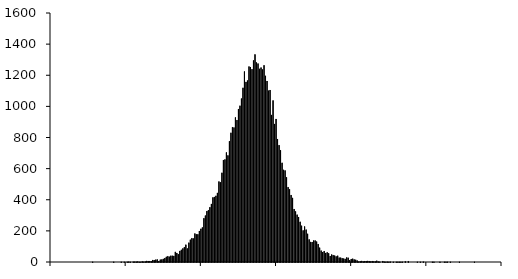
| Category | Series 0 |
|---|---|
| -1.50_-1.49 | 0 |
| -1.49_-1.48 | 0 |
| -1.48_-1.47 | 0 |
| -1.47_-1.46 | 0 |
| -1.46_-1.45 | 0 |
| -1.45_-1.44 | 0 |
| -1.44_-1.43 | 0 |
| -1.43_-1.42 | 0 |
| -1.42_-1.41 | 0 |
| -1.41_-1.40 | 0 |
| -1.40_-1.39 | 0 |
| -1.39_-1.38 | 0 |
| -1.38_-1.37 | 0 |
| -1.37_-1.36 | 0 |
| -1.36_-1.35 | 0 |
| -1.35_-1.34 | 0 |
| -1.34_-1.33 | 0 |
| -1.33_-1.32 | 0 |
| -1.32_-1.31 | 0 |
| -1.31_-1.30 | 0 |
| -1.30_-1.29 | 0 |
| -1.29_-1.28 | 0 |
| -1.28_-1.27 | 0 |
| -1.27_-1.26 | 0 |
| -1.26_-1.25 | 0 |
| -1.25_-1.24 | 0 |
| -1.24_-1.23 | 0 |
| -1.23_-1.22 | 0 |
| -1.22_-1.21 | 1 |
| -1.21_-1.20 | 0 |
| -1.20_-1.19 | 0 |
| -1.19_-1.18 | 0 |
| -1.18_-1.17 | 0 |
| -1.17_-1.16 | 0 |
| -1.16_-1.15 | 0 |
| -1.15_-1.14 | 0 |
| -1.14_-1.13 | 0 |
| -1.13_-1.12 | 0 |
| -1.12_-1.11 | 0 |
| -1.11_-1.10 | 0 |
| -1.10_-1.09 | 0 |
| -1.09_-1.08 | 0 |
| -1.08_-1.07 | 1 |
| -1.07_-1.06 | 0 |
| -1.06_-1.05 | 0 |
| -1.05_-1.04 | 0 |
| -1.04_-1.03 | 0 |
| -1.03_-1.02 | 1 |
| -1.02_-1.01 | 0 |
| -1.01_-1.00 | 1 |
| -1.00_-0.99 | 0 |
| -0.99_-0.98 | 1 |
| -0.98_-0.97 | 2 |
| -0.97_-0.96 | 1 |
| -0.96_-0.95 | 0 |
| -0.95_-0.94 | 2 |
| -0.94_-0.93 | 2 |
| -0.93_-0.92 | 2 |
| -0.92_-0.91 | 3 |
| -0.91_-0.90 | 1 |
| -0.90_-0.89 | 1 |
| -0.89_-0.88 | 4 |
| -0.88_-0.87 | 2 |
| -0.87_-0.86 | 3 |
| -0.86_-0.85 | 7 |
| -0.85_-0.84 | 6 |
| -0.84_-0.83 | 6 |
| -0.83_-0.82 | 5 |
| -0.82_-0.81 | 13 |
| -0.81_-0.80 | 12 |
| -0.80_-0.79 | 15 |
| -0.79_-0.78 | 16 |
| -0.78_-0.77 | 6 |
| -0.77_-0.76 | 15 |
| -0.76_-0.75 | 16 |
| -0.75_-0.74 | 20 |
| -0.74_-0.73 | 25 |
| -0.73_-0.72 | 33 |
| -0.72_-0.71 | 37 |
| -0.71_-0.70 | 34 |
| -0.70_-0.69 | 40 |
| -0.69_-0.68 | 40 |
| -0.68_-0.67 | 39 |
| -0.67_-0.66 | 65 |
| -0.66_-0.65 | 58 |
| -0.65_-0.64 | 50 |
| -0.64_-0.63 | 71 |
| -0.63_-0.62 | 78 |
| -0.62_-0.61 | 87 |
| -0.61_-0.60 | 95 |
| -0.60_-0.59 | 111 |
| -0.59_-0.58 | 87 |
| -0.58_-0.57 | 124 |
| -0.57_-0.56 | 143 |
| -0.56_-0.55 | 153 |
| -0.55_-0.54 | 151 |
| -0.54_-0.53 | 183 |
| -0.53_-0.52 | 178 |
| -0.52_-0.51 | 178 |
| -0.51_-0.50 | 199 |
| -0.50_-0.49 | 213 |
| -0.49_-0.48 | 222 |
| -0.48_-0.47 | 281 |
| -0.47_-0.46 | 298 |
| -0.46_-0.45 | 327 |
| -0.45_-0.44 | 333 |
| -0.44_-0.43 | 352 |
| -0.43_-0.42 | 373 |
| -0.42_-0.41 | 415 |
| -0.41_-0.40 | 418 |
| -0.40_-0.39 | 425 |
| -0.39_-0.38 | 444 |
| -0.38_-0.37 | 517 |
| -0.37_-0.36 | 512 |
| -0.36_-0.35 | 573 |
| -0.35_-0.34 | 655 |
| -0.34_-0.33 | 659 |
| -0.33_-0.32 | 704 |
| -0.32_-0.31 | 685 |
| -0.31_-0.30 | 776 |
| -0.30_-0.29 | 830 |
| -0.29_-0.28 | 866 |
| -0.28_-0.27 | 864 |
| -0.27_-0.26 | 929 |
| -0.26_-0.25 | 912 |
| -0.25_-0.24 | 983 |
| -0.24_-0.23 | 1004 |
| -0.23_-0.22 | 1050 |
| -0.22_-0.21 | 1119 |
| -0.21_-0.20 | 1224 |
| -0.20_-0.19 | 1157 |
| -0.19_-0.18 | 1166 |
| -0.18_-0.17 | 1256 |
| -0.17_-0.16 | 1253 |
| -0.16_-0.15 | 1239 |
| -0.15_-0.14 | 1295 |
| -0.14_-0.13 | 1334 |
| -0.13_-0.12 | 1282 |
| -0.12_-0.11 | 1275 |
| -0.11_-0.10 | 1241 |
| -0.10_-0.09 | 1249 |
| -0.09_-0.08 | 1237 |
| -0.08_-0.07 | 1264 |
| -0.07_-0.06 | 1196 |
| -0.06_-0.05 | 1163 |
| -0.05_-0.04 | 1101 |
| -0.04_-0.03 | 1105 |
| -0.03_-0.02 | 945 |
| -0.02_-0.01 | 1038 |
| -0.01_0.00 | 887 |
| 0.00_0.01 | 919 |
| 0.01_0.02 | 790 |
| 0.02_0.03 | 751 |
| 0.03_0.04 | 718 |
| 0.04_0.05 | 637 |
| 0.05_0.06 | 592 |
| 0.06_0.07 | 588 |
| 0.07_0.08 | 544 |
| 0.08_0.09 | 481 |
| 0.09_0.10 | 467 |
| 0.10_0.11 | 430 |
| 0.11_0.12 | 412 |
| 0.12_0.13 | 340 |
| 0.13_0.14 | 325 |
| 0.14_0.15 | 304 |
| 0.15_0.16 | 289 |
| 0.16_0.17 | 258 |
| 0.17_0.18 | 233 |
| 0.18_0.19 | 203 |
| 0.19_0.20 | 228 |
| 0.20_0.21 | 208 |
| 0.21_0.22 | 181 |
| 0.22_0.23 | 145 |
| 0.23_0.24 | 129 |
| 0.24_0.25 | 128 |
| 0.25_0.26 | 138 |
| 0.26_0.27 | 138 |
| 0.27_0.28 | 131 |
| 0.28_0.29 | 115 |
| 0.29_0.30 | 92 |
| 0.30_0.31 | 73 |
| 0.31_0.32 | 64 |
| 0.32_0.33 | 70 |
| 0.33_0.34 | 58 |
| 0.34_0.35 | 62 |
| 0.35_0.36 | 56 |
| 0.36_0.37 | 38 |
| 0.37_0.38 | 48 |
| 0.38_0.39 | 44 |
| 0.39_0.40 | 41 |
| 0.40_0.41 | 36 |
| 0.41_0.42 | 40 |
| 0.42_0.43 | 28 |
| 0.43_0.44 | 28 |
| 0.44_0.45 | 24 |
| 0.45_0.46 | 22 |
| 0.46_0.47 | 20 |
| 0.47_0.48 | 29 |
| 0.48_0.49 | 27 |
| 0.49_0.50 | 12 |
| 0.50_0.51 | 19 |
| 0.51_0.52 | 21 |
| 0.52_0.53 | 16 |
| 0.53_0.54 | 14 |
| 0.54_0.55 | 9 |
| 0.55_0.56 | 3 |
| 0.56_0.57 | 5 |
| 0.57_0.58 | 7 |
| 0.58_0.59 | 4 |
| 0.59_0.60 | 6 |
| 0.60_0.61 | 6 |
| 0.61_0.62 | 7 |
| 0.62_0.63 | 6 |
| 0.63_0.64 | 4 |
| 0.64_0.65 | 6 |
| 0.65_0.66 | 4 |
| 0.66_0.67 | 4 |
| 0.67_0.68 | 8 |
| 0.68_0.69 | 3 |
| 0.69_0.70 | 2 |
| 0.70_0.71 | 0 |
| 0.71_0.72 | 6 |
| 0.72_0.73 | 2 |
| 0.73_0.74 | 1 |
| 0.74_0.75 | 2 |
| 0.75_0.76 | 1 |
| 0.76_0.77 | 2 |
| 0.77_0.78 | 0 |
| 0.78_0.79 | 1 |
| 0.79_0.80 | 0 |
| 0.80_0.81 | 1 |
| 0.81_0.82 | 1 |
| 0.82_0.83 | 1 |
| 0.83_0.84 | 1 |
| 0.84_0.85 | 1 |
| 0.85_0.86 | 0 |
| 0.86_0.87 | 4 |
| 0.87_0.88 | 0 |
| 0.88_0.89 | 5 |
| 0.89_0.90 | 0 |
| 0.90_0.91 | 0 |
| 0.91_0.92 | 0 |
| 0.92_0.93 | 0 |
| 0.93_0.94 | 0 |
| 0.94_0.95 | 1 |
| 0.95_0.96 | 0 |
| 0.96_0.97 | 1 |
| 0.97_0.98 | 0 |
| 0.98_0.99 | 2 |
| 0.99_1.00 | 0 |
| 1.00_1.01 | 0 |
| 1.01_1.02 | 0 |
| 1.02_1.03 | 0 |
| 1.03_1.04 | 0 |
| 1.04_1.05 | 1 |
| 1.05_1.06 | 1 |
| 1.06_1.07 | 0 |
| 1.07_1.08 | 0 |
| 1.08_1.09 | 0 |
| 1.09_1.10 | 1 |
| 1.10_1.11 | 0 |
| 1.11_1.12 | 0 |
| 1.12_1.13 | 1 |
| 1.13_1.14 | 1 |
| 1.14_1.15 | 1 |
| 1.15_1.16 | 0 |
| 1.16_1.17 | 1 |
| 1.17_1.18 | 0 |
| 1.18_1.19 | 0 |
| 1.19_1.20 | 0 |
| 1.20_1.21 | 0 |
| 1.21_1.22 | 0 |
| 1.22_1.23 | 1 |
| 1.23_1.24 | 0 |
| 1.24_1.25 | 0 |
| 1.25_1.26 | 0 |
| 1.26_1.27 | 0 |
| 1.27_1.28 | 0 |
| 1.28_1.29 | 0 |
| 1.29_1.30 | 0 |
| 1.30_1.31 | 0 |
| 1.31_1.32 | 0 |
| 1.32_1.33 | 1 |
| 1.33_1.34 | 0 |
| 1.34_1.35 | 0 |
| 1.35_1.36 | 0 |
| 1.36_1.37 | 0 |
| 1.37_1.38 | 0 |
| 1.38_1.39 | 0 |
| 1.39_1.40 | 0 |
| 1.40_1.41 | 0 |
| 1.41_1.42 | 0 |
| 1.42_1.43 | 0 |
| 1.43_1.44 | 0 |
| 1.44_1.45 | 0 |
| 1.45_1.46 | 0 |
| 1.46_1.47 | 0 |
| 1.47_1.48 | 0 |
| 1.48_1.49 | 0 |
| 1.49_1.50 | 0 |